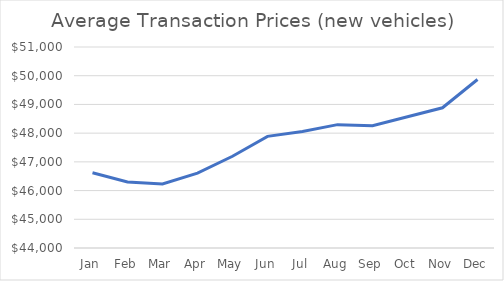
| Category | Series 0 |
|---|---|
| Jan | 46620 |
| Feb | 46299 |
| Mar | 46227 |
| Apr | 46608 |
| May | 47196 |
| Jun | 47887 |
| Jul | 48057 |
| Aug | 48296 |
| Sep | 48258 |
| Oct | 48573 |
| Nov | 48883 |
| Dec | 49867 |